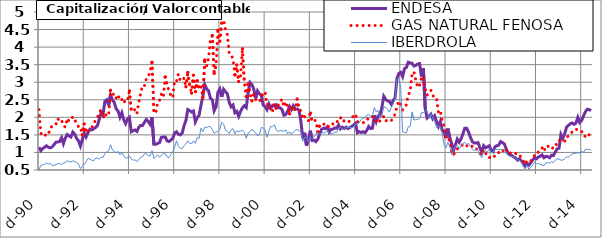
| Category | ENDESA | GAS NATURAL FENOSA | IBERDROLA |
|---|---|---|---|
| 1990-12-01 | 1.15 | 2.22 | 0.51 |
| 1991-01-01 | 1.05 | 1.55 | 0.63 |
| 1991-02-01 | 1.11 | 1.48 | 0.65 |
| 1991-03-01 | 1.15 | 1.46 | 0.66 |
| 1991-04-01 | 1.19 | 1.54 | 0.7 |
| 1991-05-01 | 1.15 | 1.52 | 0.67 |
| 1991-06-01 | 1.13 | 1.69 | 0.69 |
| 1991-07-01 | 1.16 | 1.75 | 0.62 |
| 1991-08-01 | 1.22 | 1.75 | 0.64 |
| 1991-09-01 | 1.29 | 1.8 | 0.65 |
| 1991-10-01 | 1.3 | 1.96 | 0.68 |
| 1991-11-01 | 1.31 | 1.89 | 0.68 |
| 1991-12-01 | 1.42 | 1.92 | 0.66 |
| 1992-01-01 | 1.25 | 1.77 | 0.7 |
| 1992-02-01 | 1.41 | 1.72 | 0.71 |
| 1992-03-01 | 1.51 | 1.97 | 0.77 |
| 1992-04-01 | 1.47 | 1.89 | 0.73 |
| 1992-05-01 | 1.44 | 1.93 | 0.73 |
| 1992-06-01 | 1.58 | 2.02 | 0.76 |
| 1992-07-01 | 1.52 | 1.92 | 0.74 |
| 1992-08-01 | 1.4 | 1.84 | 0.71 |
| 1992-09-01 | 1.33 | 1.73 | 0.67 |
| 1992-10-01 | 1.18 | 1.73 | 0.54 |
| 1992-11-01 | 1.36 | 1.5 | 0.6 |
| 1992-12-01 | 1.55 | 1.81 | 0.66 |
| 1993-01-01 | 1.44 | 1.55 | 0.73 |
| 1993-02-01 | 1.56 | 1.62 | 0.83 |
| 1993-03-01 | 1.66 | 1.66 | 0.81 |
| 1993-04-01 | 1.64 | 1.71 | 0.78 |
| 1993-05-01 | 1.67 | 1.79 | 0.76 |
| 1993-06-01 | 1.71 | 1.92 | 0.83 |
| 1993-07-01 | 1.76 | 2 | 0.84 |
| 1993-08-01 | 1.94 | 2.11 | 0.81 |
| 1993-09-01 | 2.14 | 2.23 | 0.86 |
| 1993-10-01 | 2.08 | 1.98 | 0.86 |
| 1993-11-01 | 2.46 | 2.12 | 0.97 |
| 1993-12-01 | 2.5 | 2.03 | 1.02 |
| 1994-01-01 | 2.34 | 2.07 | 1.05 |
| 1994-02-01 | 2.63 | 2.77 | 1.22 |
| 1994-03-01 | 2.5 | 2.64 | 1.07 |
| 1994-04-01 | 2.42 | 2.68 | 1.03 |
| 1994-05-01 | 2.24 | 2.55 | 0.99 |
| 1994-06-01 | 2.18 | 2.64 | 1.03 |
| 1994-07-01 | 2 | 2.48 | 0.93 |
| 1994-08-01 | 2.13 | 2.51 | 1 |
| 1994-09-01 | 1.93 | 2.4 | 0.9 |
| 1994-10-01 | 1.82 | 2.51 | 0.84 |
| 1994-11-01 | 1.95 | 2.49 | 0.85 |
| 1994-12-01 | 2 | 2.75 | 0.9 |
| 1995-01-01 | 1.59 | 2.2 | 0.81 |
| 1995-02-01 | 1.62 | 2.16 | 0.78 |
| 1995-03-01 | 1.64 | 2.23 | 0.79 |
| 1995-04-01 | 1.6 | 2.11 | 0.74 |
| 1995-05-01 | 1.72 | 2.44 | 0.79 |
| 1995-06-01 | 1.77 | 2.69 | 0.86 |
| 1995-07-01 | 1.77 | 2.91 | 0.88 |
| 1995-08-01 | 1.86 | 2.9 | 0.96 |
| 1995-09-01 | 1.94 | 3.1 | 0.96 |
| 1995-10-01 | 1.88 | 3.15 | 0.91 |
| 1995-11-01 | 1.8 | 3.32 | 0.9 |
| 1995-12-01 | 2 | 3.57 | 1.05 |
| 1996-01-01 | 1.23 | 2.17 | 0.83 |
| 1996-02-01 | 1.23 | 2.11 | 0.88 |
| 1996-03-01 | 1.26 | 2.43 | 0.93 |
| 1996-04-01 | 1.28 | 2.48 | 0.86 |
| 1996-05-01 | 1.43 | 2.66 | 0.93 |
| 1996-06-01 | 1.44 | 2.57 | 0.98 |
| 1996-07-01 | 1.44 | 3.15 | 0.97 |
| 1996-08-01 | 1.33 | 2.92 | 0.87 |
| 1996-09-01 | 1.31 | 2.77 | 0.85 |
| 1996-10-01 | 1.35 | 2.62 | 0.94 |
| 1996-11-01 | 1.4 | 2.56 | 1.01 |
| 1996-12-01 | 1.55 | 3.05 | 1.15 |
| 1997-01-01 | 1.59 | 3.03 | 1.33 |
| 1997-02-01 | 1.52 | 3.23 | 1.17 |
| 1997-03-01 | 1.5 | 3.05 | 1.12 |
| 1997-04-01 | 1.55 | 3.04 | 1.11 |
| 1997-05-01 | 1.76 | 3.12 | 1.19 |
| 1997-06-01 | 1.91 | 2.87 | 1.24 |
| 1997-07-01 | 2.22 | 3.28 | 1.33 |
| 1997-08-01 | 2.19 | 2.91 | 1.26 |
| 1997-09-01 | 2.15 | 2.69 | 1.25 |
| 1997-10-01 | 2.18 | 3.2 | 1.33 |
| 1997-11-01 | 1.87 | 2.73 | 1.26 |
| 1997-12-01 | 1.99 | 3.04 | 1.42 |
| 1998-01-01 | 2.06 | 2.81 | 1.4 |
| 1998-02-01 | 2.35 | 2.88 | 1.69 |
| 1998-03-01 | 2.6 | 2.56 | 1.59 |
| 1998-04-01 | 2.93 | 3.63 | 1.72 |
| 1998-05-01 | 2.81 | 3.47 | 1.71 |
| 1998-06-01 | 2.76 | 3.69 | 1.74 |
| 1998-07-01 | 2.54 | 4.21 | 1.74 |
| 1998-08-01 | 2.5 | 4.33 | 1.65 |
| 1998-09-01 | 2.19 | 3.25 | 1.55 |
| 1998-10-01 | 2.3 | 3.48 | 1.58 |
| 1998-11-01 | 2.72 | 4.48 | 1.6 |
| 1998-12-01 | 2.81 | 4.17 | 1.66 |
| 1999-01-01 | 2.58 | 4.72 | 1.86 |
| 1999-02-01 | 2.8 | 4.76 | 1.81 |
| 1999-03-01 | 2.73 | 4.51 | 1.63 |
| 1999-04-01 | 2.67 | 4.35 | 1.6 |
| 1999-05-01 | 2.42 | 3.81 | 1.54 |
| 1999-06-01 | 2.3 | 3.78 | 1.65 |
| 1999-07-01 | 2.35 | 3.66 | 1.68 |
| 1999-08-01 | 2.13 | 3.21 | 1.53 |
| 1999-09-01 | 2.17 | 3.49 | 1.62 |
| 1999-10-01 | 2.03 | 3.02 | 1.59 |
| 1999-11-01 | 2.17 | 3.17 | 1.61 |
| 1999-12-01 | 2.27 | 3.95 | 1.63 |
| 2000-01-01 | 2.33 | 3 | 1.58 |
| 2000-02-01 | 2.28 | 2.59 | 1.4 |
| 2000-03-01 | 2.7 | 2.95 | 1.55 |
| 2000-04-01 | 2.99 | 2.7 | 1.59 |
| 2000-05-01 | 2.93 | 2.47 | 1.66 |
| 2000-06-01 | 2.81 | 2.65 | 1.62 |
| 2000-07-01 | 2.54 | 2.51 | 1.56 |
| 2000-08-01 | 2.75 | 2.45 | 1.48 |
| 2000-09-01 | 2.67 | 2.44 | 1.5 |
| 2000-10-01 | 2.63 | 2.55 | 1.71 |
| 2000-11-01 | 2.35 | 2.71 | 1.7 |
| 2000-12-01 | 2.31 | 2.72 | 1.64 |
| 2001-01-01 | 2.22 | 2.36 | 1.43 |
| 2001-02-01 | 2.38 | 2.39 | 1.6 |
| 2001-03-01 | 2.26 | 2.16 | 1.74 |
| 2001-04-01 | 2.34 | 2.19 | 1.74 |
| 2001-05-01 | 2.32 | 2.39 | 1.79 |
| 2001-06-01 | 2.36 | 2.22 | 1.63 |
| 2001-07-01 | 2.27 | 2.34 | 1.6 |
| 2001-08-01 | 2.27 | 2.44 | 1.62 |
| 2001-09-01 | 2.22 | 2.52 | 1.62 |
| 2001-10-01 | 2.06 | 2.3 | 1.59 |
| 2001-11-01 | 2.08 | 2.44 | 1.65 |
| 2001-12-01 | 2.17 | 2.31 | 1.53 |
| 2002-01-01 | 2.31 | 2.1 | 1.59 |
| 2002-02-01 | 2.22 | 2.31 | 1.51 |
| 2002-03-01 | 2.33 | 2.24 | 1.58 |
| 2002-04-01 | 2.24 | 2.21 | 1.63 |
| 2002-05-01 | 2.24 | 2.52 | 1.65 |
| 2002-06-01 | 2.2 | 2.24 | 1.63 |
| 2002-07-01 | 1.89 | 2.18 | 1.57 |
| 2002-08-01 | 1.4 | 1.95 | 1.32 |
| 2002-09-01 | 1.56 | 2.02 | 1.43 |
| 2002-10-01 | 1.19 | 1.95 | 1.42 |
| 2002-11-01 | 1.37 | 1.9 | 1.3 |
| 2002-12-01 | 1.62 | 2.12 | 1.45 |
| 2003-01-01 | 1.34 | 1.88 | 1.4 |
| 2003-02-01 | 1.35 | 1.92 | 1.45 |
| 2003-03-01 | 1.31 | 1.9 | 1.49 |
| 2003-04-01 | 1.38 | 1.58 | 1.58 |
| 2003-05-01 | 1.53 | 1.78 | 1.52 |
| 2003-06-01 | 1.66 | 1.79 | 1.56 |
| 2003-07-01 | 1.69 | 1.82 | 1.56 |
| 2003-08-01 | 1.68 | 1.75 | 1.57 |
| 2003-09-01 | 1.73 | 1.77 | 1.64 |
| 2003-10-01 | 1.58 | 1.72 | 1.54 |
| 2003-11-01 | 1.66 | 1.74 | 1.53 |
| 2003-12-01 | 1.66 | 1.81 | 1.54 |
| 2004-01-01 | 1.7 | 1.79 | 1.58 |
| 2004-02-01 | 1.69 | 1.84 | 1.57 |
| 2004-03-01 | 1.78 | 1.98 | 1.69 |
| 2004-04-01 | 1.67 | 1.98 | 1.71 |
| 2004-05-01 | 1.72 | 2.01 | 1.68 |
| 2004-06-01 | 1.68 | 1.88 | 1.65 |
| 2004-07-01 | 1.72 | 1.88 | 1.71 |
| 2004-08-01 | 1.68 | 1.86 | 1.71 |
| 2004-09-01 | 1.71 | 1.9 | 1.71 |
| 2004-10-01 | 1.74 | 1.96 | 1.71 |
| 2004-11-01 | 1.78 | 2.06 | 1.73 |
| 2004-12-01 | 1.83 | 2.09 | 1.8 |
| 2005-01-01 | 1.56 | 1.88 | 1.8 |
| 2005-02-01 | 1.59 | 1.86 | 1.85 |
| 2005-03-01 | 1.57 | 1.88 | 1.94 |
| 2005-04-01 | 1.59 | 1.85 | 1.98 |
| 2005-05-01 | 1.56 | 1.85 | 1.98 |
| 2005-06-01 | 1.63 | 1.91 | 2.06 |
| 2005-07-01 | 1.74 | 2 | 2.09 |
| 2005-08-01 | 1.68 | 2.03 | 2.03 |
| 2005-09-01 | 1.69 | 2.02 | 2.05 |
| 2005-10-01 | 2.06 | 2.01 | 2.28 |
| 2005-11-01 | 1.88 | 1.87 | 2.16 |
| 2005-12-01 | 2.04 | 1.93 | 2.19 |
| 2006-01-01 | 2.06 | 1.89 | 1.97 |
| 2006-02-01 | 2.29 | 1.94 | 2.05 |
| 2006-03-01 | 2.6 | 2.03 | 2.3 |
| 2006-04-01 | 2.51 | 1.9 | 2.29 |
| 2006-05-01 | 2.47 | 1.92 | 2.23 |
| 2006-06-01 | 2.45 | 1.89 | 2.15 |
| 2006-07-01 | 2.37 | 1.91 | 2.28 |
| 2006-08-01 | 2.48 | 1.99 | 2.38 |
| 2006-09-01 | 2.56 | 2.09 | 2.51 |
| 2006-10-01 | 3.11 | 2.31 | 3.07 |
| 2006-11-01 | 3.25 | 2.46 | 3.11 |
| 2006-12-01 | 3.28 | 2.37 | 2.85 |
| 2007-01-01 | 3.16 | 2.21 | 1.58 |
| 2007-02-01 | 3.39 | 2.26 | 1.57 |
| 2007-03-01 | 3.42 | 2.36 | 1.56 |
| 2007-04-01 | 3.57 | 2.64 | 1.73 |
| 2007-05-01 | 3.55 | 2.74 | 1.74 |
| 2007-06-01 | 3.54 | 3.23 | 2.15 |
| 2007-07-01 | 3.46 | 3.3 | 1.93 |
| 2007-08-01 | 3.48 | 3.06 | 1.93 |
| 2007-09-01 | 3.52 | 2.85 | 1.94 |
| 2007-10-01 | 3.53 | 2.92 | 1.97 |
| 2007-11-01 | 3.16 | 3.12 | 2.13 |
| 2007-12-01 | 3.4 | 3.18 | 2.13 |
| 2008-01-01 | 2.25 | 2.81 | 2.19 |
| 2008-02-01 | 1.98 | 2.63 | 2.18 |
| 2008-03-01 | 2.03 | 2.72 | 1.96 |
| 2008-04-01 | 2.09 | 2.77 | 2.1 |
| 2008-05-01 | 1.96 | 2.63 | 1.98 |
| 2008-06-01 | 2.04 | 2.54 | 1.88 |
| 2008-07-01 | 1.88 | 2.54 | 1.71 |
| 2008-08-01 | 1.74 | 2.14 | 1.77 |
| 2008-09-01 | 1.88 | 2.19 | 1.73 |
| 2008-10-01 | 1.63 | 1.87 | 1.54 |
| 2008-11-01 | 1.58 | 1.76 | 1.22 |
| 2008-12-01 | 1.41 | 1.4 | 1.13 |
| 2009-01-01 | 1.68 | 1.42 | 1.29 |
| 2009-02-01 | 1.43 | 1.33 | 1.17 |
| 2009-03-01 | 1.25 | 0.99 | 0.94 |
| 2009-04-01 | 1.04 | 0.92 | 1.05 |
| 2009-05-01 | 1.22 | 1.04 | 1.18 |
| 2009-06-01 | 1.38 | 1.1 | 1.2 |
| 2009-07-01 | 1.29 | 1.14 | 1.11 |
| 2009-08-01 | 1.39 | 1.17 | 1.19 |
| 2009-09-01 | 1.53 | 1.24 | 1.25 |
| 2009-10-01 | 1.69 | 1.24 | 1.29 |
| 2009-11-01 | 1.69 | 1.19 | 1.22 |
| 2009-12-01 | 1.58 | 1.22 | 1.26 |
| 2010-01-01 | 1.43 | 1.22 | 1.17 |
| 2010-02-01 | 1.31 | 1.17 | 1.09 |
| 2010-03-01 | 1.27 | 1.1 | 1.05 |
| 2010-04-01 | 1.27 | 1.11 | 1.11 |
| 2010-05-01 | 1.28 | 1.04 | 1.05 |
| 2010-06-01 | 1.13 | 0.97 | 0.94 |
| 2010-07-01 | 1.01 | 0.93 | 0.85 |
| 2010-08-01 | 1.19 | 1.08 | 1.02 |
| 2010-09-01 | 1.13 | 0.99 | 1.04 |
| 2010-10-01 | 1.16 | 0.87 | 1.02 |
| 2010-11-01 | 1.19 | 0.85 | 1.1 |
| 2010-12-01 | 1.06 | 0.88 | 1 |
| 2011-01-01 | 1.02 | 0.85 | 1 |
| 2011-02-01 | 1.16 | 0.91 | 1.1 |
| 2011-03-01 | 1.19 | 0.92 | 1.08 |
| 2011-04-01 | 1.21 | 1 | 1.08 |
| 2011-05-01 | 1.31 | 1.05 | 1.09 |
| 2011-06-01 | 1.28 | 1.02 | 1.06 |
| 2011-07-01 | 1.24 | 1.13 | 1.08 |
| 2011-08-01 | 1.1 | 1.06 | 0.98 |
| 2011-09-01 | 0.98 | 0.97 | 0.91 |
| 2011-10-01 | 0.94 | 0.98 | 0.89 |
| 2011-11-01 | 0.91 | 1 | 0.88 |
| 2011-12-01 | 0.87 | 1.01 | 0.88 |
| 2012-01-01 | 0.84 | 0.97 | 0.82 |
| 2012-02-01 | 0.78 | 0.91 | 0.79 |
| 2012-03-01 | 0.82 | 0.92 | 0.77 |
| 2012-04-01 | 0.76 | 0.86 | 0.73 |
| 2012-05-01 | 0.69 | 0.76 | 0.6 |
| 2012-06-01 | 0.62 | 0.66 | 0.53 |
| 2012-07-01 | 0.69 | 0.77 | 0.64 |
| 2012-08-01 | 0.64 | 0.76 | 0.52 |
| 2012-09-01 | 0.71 | 0.75 | 0.58 |
| 2012-10-01 | 0.78 | 0.85 | 0.64 |
| 2012-11-01 | 0.85 | 0.91 | 0.72 |
| 2012-12-01 | 0.82 | 0.91 | 0.68 |
| 2013-01-01 | 0.87 | 1.01 | 0.69 |
| 2013-02-01 | 0.89 | 1.1 | 0.66 |
| 2013-03-01 | 0.93 | 1.13 | 0.64 |
| 2013-04-01 | 0.85 | 1.03 | 0.62 |
| 2013-05-01 | 0.89 | 1.18 | 0.7 |
| 2013-06-01 | 0.88 | 1.19 | 0.71 |
| 2013-07-01 | 0.85 | 1.12 | 0.7 |
| 2013-08-01 | 0.92 | 1.15 | 0.74 |
| 2013-09-01 | 0.91 | 1.11 | 0.71 |
| 2013-10-01 | 1.01 | 1.16 | 0.77 |
| 2013-11-01 | 1.1 | 1.29 | 0.82 |
| 2013-12-01 | 1.12 | 1.35 | 0.81 |
| 2014-01-01 | 1.51 | 1.32 | 0.78 |
| 2014-02-01 | 1.4 | 1.29 | 0.78 |
| 2014-03-01 | 1.53 | 1.31 | 0.82 |
| 2014-04-01 | 1.72 | 1.45 | 0.87 |
| 2014-05-01 | 1.77 | 1.46 | 0.87 |
| 2014-06-01 | 1.82 | 1.5 | 0.91 |
| 2014-07-01 | 1.84 | 1.59 | 0.96 |
| 2014-08-01 | 1.8 | 1.6 | 0.97 |
| 2014-09-01 | 1.84 | 1.66 | 0.98 |
| 2014-10-01 | 2 | 1.64 | 0.99 |
| 2014-11-01 | 1.85 | 1.6 | 0.98 |
| 2014-12-01 | 1.91 | 1.6 | 1.04 |
| 2015-01-01 | 2.04 | 1.47 | 1 |
| 2015-02-01 | 2.16 | 1.46 | 1.09 |
| 2015-03-01 | 2.23 | 1.54 | 1.09 |
| 2015-04-01 | 2.22 | 1.5 | 1.08 |
| 2015-05-01 | 2.19 | 1.55 | 1.07 |